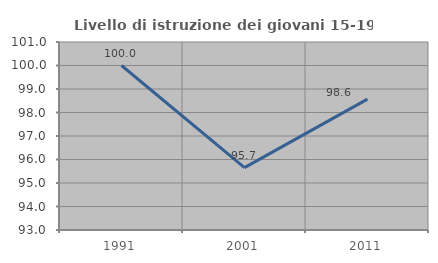
| Category | Livello di istruzione dei giovani 15-19 anni |
|---|---|
| 1991.0 | 100 |
| 2001.0 | 95.652 |
| 2011.0 | 98.571 |